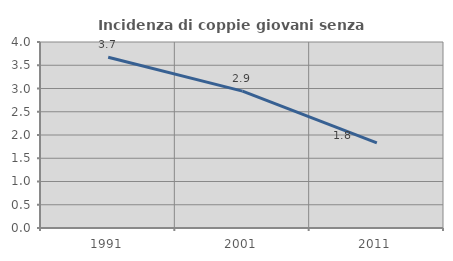
| Category | Incidenza di coppie giovani senza figli |
|---|---|
| 1991.0 | 3.672 |
| 2001.0 | 2.944 |
| 2011.0 | 1.833 |